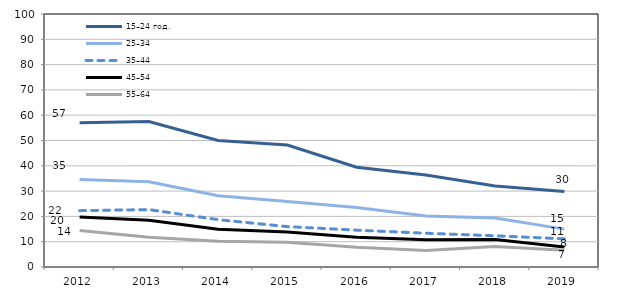
| Category | 15–24 год. | 25–34  | 35–44  | 45–54  | 55–64  |
|---|---|---|---|---|---|
| 2012.0 | 56.995 | 34.562 | 22.277 | 19.78 | 14.436 |
| 2013.0 | 57.469 | 33.713 | 22.68 | 18.46 | 11.731 |
| 2014.0 | 49.988 | 28.151 | 18.717 | 14.91 | 10.163 |
| 2015.0 | 48.204 | 25.913 | 15.958 | 13.823 | 9.762 |
| 2016.0 | 39.452 | 23.518 | 14.565 | 11.783 | 7.765 |
| 2017.0 | 36.331 | 20.206 | 13.347 | 10.801 | 6.554 |
| 2018.0 | 32.017 | 19.334 | 12.335 | 10.869 | 8.105 |
| 2019.0 | 29.872 | 14.971 | 11.127 | 7.886 | 6.619 |